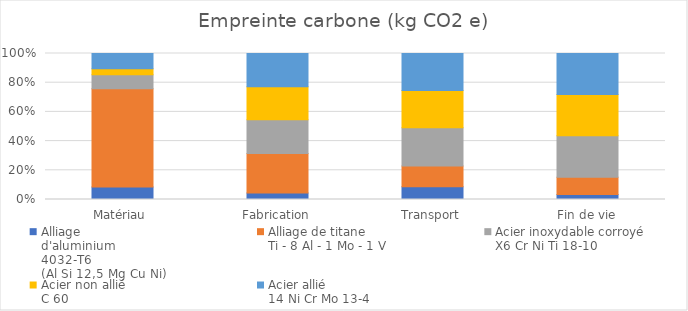
| Category | Alliage
d'aluminium
4032-T6
(Al Si 12,5 Mg Cu Ni) | Alliage de titane
Ti - 8 Al - 1 Mo - 1 V | Acier inoxydable corroyé
X6 Cr Ni Ti 18-10 | Acier non allié
C 60 | Acier allié
14 Ni Cr Mo 13-4 |
|---|---|---|---|---|---|
| Matériau | 3.7 | 29 | 4.1 | 1.8 | 4.5 |
| Fabrication | 0.137 | 0.848 | 0.718 | 0.709 | 0.709 |
| Transport | 0.011 | 0.018 | 0.033 | 0.032 | 0.032 |
| Fin de vie | 0.091 | 0.312 | 0.755 | 0.746 | 0.746 |